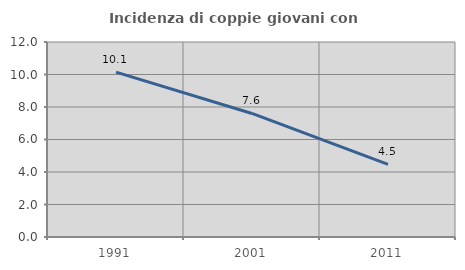
| Category | Incidenza di coppie giovani con figli |
|---|---|
| 1991.0 | 10.145 |
| 2001.0 | 7.602 |
| 2011.0 | 4.469 |